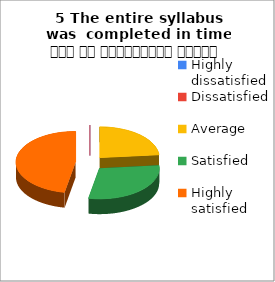
| Category | 5 The entire syllabus was  completed in time समय पर पाठ्यक्रम पूर्ण हुआ |
|---|---|
| Highly dissatisfied | 0 |
| Dissatisfied | 0 |
| Average | 4 |
| Satisfied | 5 |
| Highly satisfied | 8 |